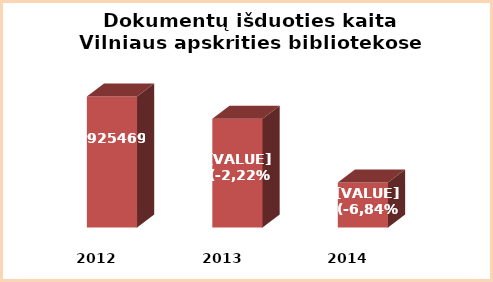
| Category | Series 0 |
|---|---|
| 2012.0 | 2925469 |
| 2013.0 | 2862057 |
| 2014.0 | 2678800 |